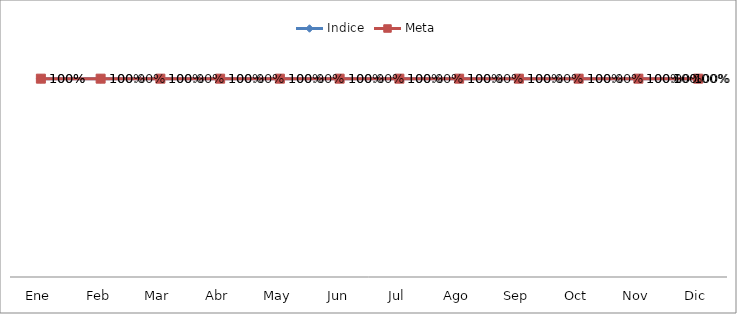
| Category | Indice | Meta |
|---|---|---|
| Ene | 1 | 1 |
| Feb | 1 | 1 |
| Mar | 1 | 1 |
| Abr | 1 | 1 |
| May | 1 | 1 |
| Jun | 1 | 1 |
| Jul | 1 | 1 |
| Ago | 1 | 1 |
| Sep | 1 | 1 |
| Oct | 1 | 1 |
| Nov | 1 | 1 |
| Dic | 1 | 1 |